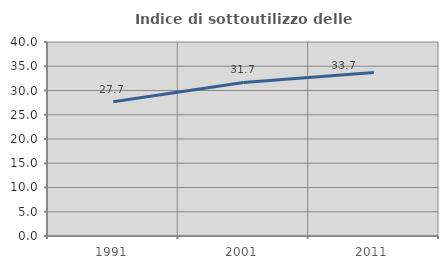
| Category | Indice di sottoutilizzo delle abitazioni  |
|---|---|
| 1991.0 | 27.683 |
| 2001.0 | 31.669 |
| 2011.0 | 33.703 |